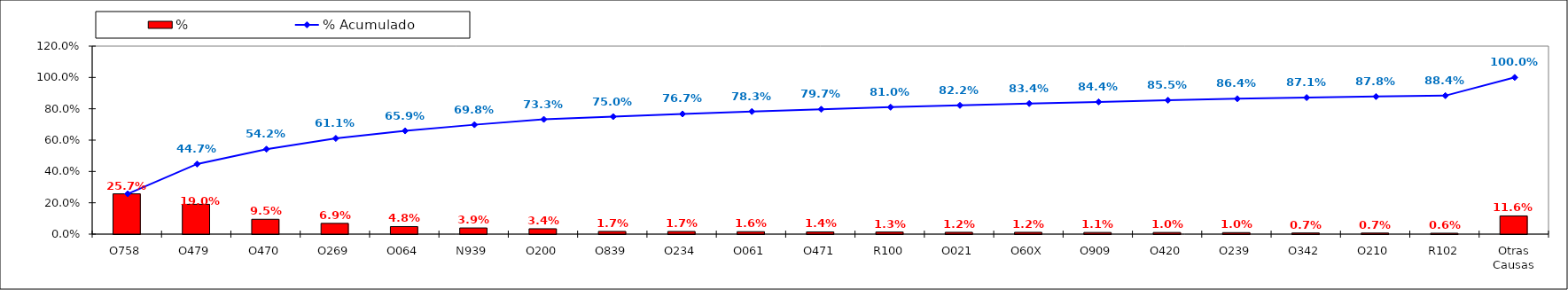
| Category | % |
|---|---|
| O758 | 0.257 |
| O479 | 0.19 |
| O470 | 0.095 |
| O269 | 0.069 |
| O064 | 0.048 |
| N939 | 0.039 |
| O200 | 0.034 |
| O839 | 0.017 |
| O234 | 0.017 |
| O061 | 0.016 |
| O471 | 0.014 |
| R100 | 0.013 |
| O021 | 0.012 |
| O60X | 0.012 |
| O909 | 0.011 |
| O420 | 0.01 |
| O239 | 0.01 |
| O342 | 0.007 |
| O210 | 0.007 |
| R102 | 0.006 |
| Otras Causas | 0.116 |